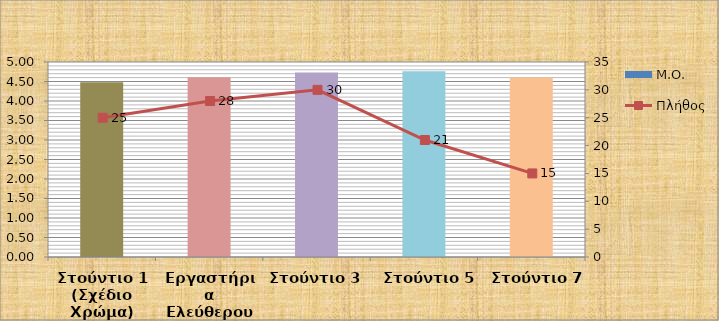
| Category | Μ.Ο. |
|---|---|
| Στούντιο 1 (Σχέδιο Χρώμα) | 4.48 |
| Εργαστήρια Ελεύθερου Σχεδίου 1 | 4.607 |
| Στούντιο 3  | 4.733 |
| Στούντιο 5 | 4.762 |
| Στούντιο 7 | 4.6 |